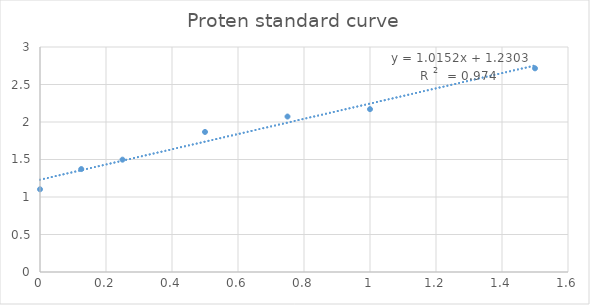
| Category | Series 0 |
|---|---|
| 1.5 | 2.716 |
| 1.0 | 2.171 |
| 0.75 | 2.073 |
| 0.5 | 1.867 |
| 0.25 | 1.498 |
| 0.125 | 1.372 |
| 0.0 | 1.103 |